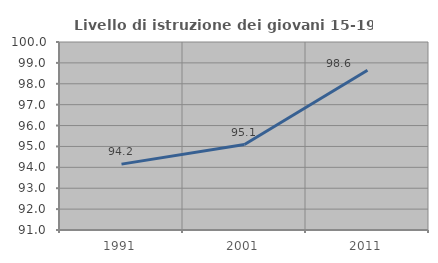
| Category | Livello di istruzione dei giovani 15-19 anni |
|---|---|
| 1991.0 | 94.154 |
| 2001.0 | 95.089 |
| 2011.0 | 98.644 |